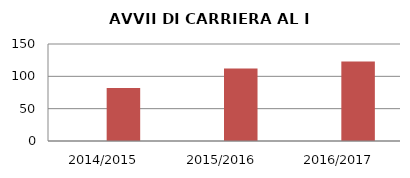
| Category | ANNO | NUMERO |
|---|---|---|
| 2014/2015 | 0 | 82 |
| 2015/2016 | 0 | 112 |
| 2016/2017 | 0 | 123 |